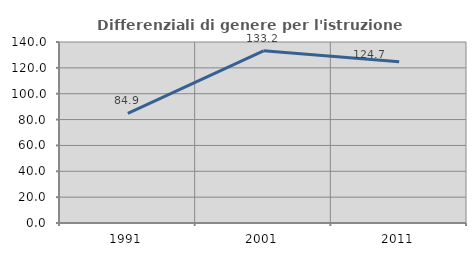
| Category | Differenziali di genere per l'istruzione superiore |
|---|---|
| 1991.0 | 84.854 |
| 2001.0 | 133.185 |
| 2011.0 | 124.662 |